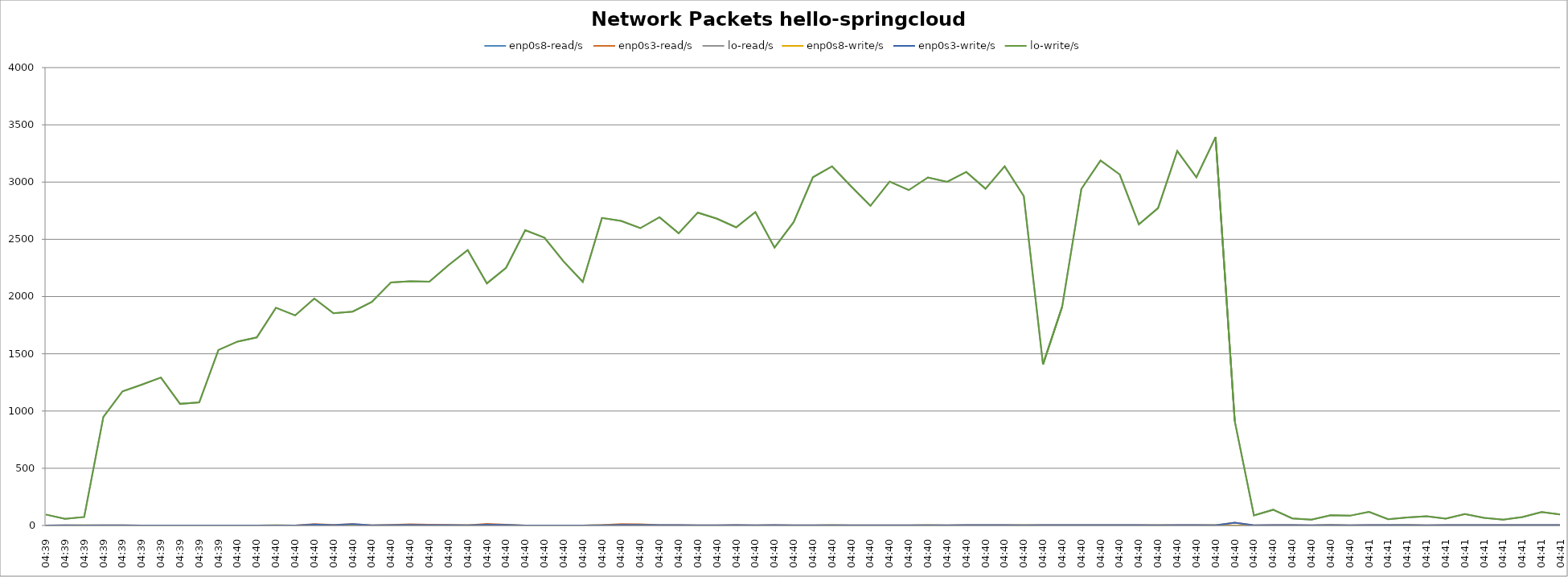
| Category | enp0s8-read/s | enp0s3-read/s | lo-read/s | enp0s8-write/s | enp0s3-write/s | lo-write/s |
|---|---|---|---|---|---|---|
| 04:39 | 0 | 0.3 | 95.9 | 0 | 0.3 | 95.9 |
| 04:39 | 0 | 1 | 58.6 | 0 | 1 | 58.6 |
| 04:39 | 1 | 0 | 74.5 | 1 | 0 | 74.5 |
| 04:39 | 0 | 1 | 948.6 | 0 | 1 | 948.6 |
| 04:39 | 0 | 1 | 1172.2 | 0 | 1 | 1172.2 |
| 04:39 | 0 | 0 | 1230 | 0 | 0 | 1230 |
| 04:39 | 0 | 0 | 1292.6 | 0 | 0 | 1292.6 |
| 04:39 | 0 | 0 | 1062.6 | 0 | 0 | 1062.6 |
| 04:39 | 0 | 0 | 1075.6 | 0 | 0 | 1075.6 |
| 04:39 | 0 | 0 | 1532.9 | 0 | 0 | 1532.9 |
| 04:40 | 0 | 0 | 1606.9 | 0 | 0 | 1606.9 |
| 04:40 | 0 | 0 | 1643.1 | 0 | 0 | 1643.1 |
| 04:40 | 1 | 0 | 1902.1 | 1 | 0 | 1902.1 |
| 04:40 | 0 | 0 | 1835.3 | 0 | 0 | 1835.3 |
| 04:40 | 0 | 11.8 | 1982.7 | 0 | 8.9 | 1982.7 |
| 04:40 | 0 | 4.9 | 1853.8 | 0 | 2.9 | 1853.8 |
| 04:40 | 0 | 11.7 | 1868.1 | 0 | 11.7 | 1868.1 |
| 04:40 | 0 | 1 | 1952.9 | 0 | 1 | 1952.9 |
| 04:40 | 0 | 5.9 | 2123.6 | 0 | 3 | 2123.6 |
| 04:40 | 0 | 9.8 | 2133.8 | 0 | 4.9 | 2133.8 |
| 04:40 | 0 | 6.9 | 2130 | 0 | 3.9 | 2130 |
| 04:40 | 0 | 5.9 | 2274.7 | 0 | 3.9 | 2274.7 |
| 04:40 | 2 | 2 | 2406.7 | 2 | 1 | 2406.7 |
| 04:40 | 0 | 14.8 | 2115.1 | 0 | 7.9 | 2115.1 |
| 04:40 | 0 | 7.9 | 2251.3 | 0 | 4.9 | 2251.3 |
| 04:40 | 0 | 0 | 2579.7 | 0 | 0 | 2579.7 |
| 04:40 | 0 | 0 | 2514.4 | 0 | 0 | 2514.4 |
| 04:40 | 0 | 0 | 2306.6 | 0 | 0 | 2306.6 |
| 04:40 | 0 | 0 | 2128 | 0 | 0 | 2128 |
| 04:40 | 1 | 3.9 | 2686.4 | 1 | 2 | 2686.4 |
| 04:40 | 0 | 11.9 | 2660.2 | 0 | 5.9 | 2660.2 |
| 04:40 | 1 | 9.9 | 2597.5 | 1 | 5.9 | 2597.5 |
| 04:40 | 0 | 3 | 2692.6 | 0 | 3 | 2692.6 |
| 04:40 | 0 | 3 | 2552.8 | 0 | 3 | 2552.8 |
| 04:40 | 0 | 2 | 2733.4 | 0 | 2 | 2733.4 |
| 04:40 | 0 | 2 | 2680.1 | 0 | 2 | 2680.1 |
| 04:40 | 0 | 3 | 2604.6 | 0 | 3 | 2604.6 |
| 04:40 | 0 | 1 | 2738.2 | 0 | 1 | 2738.2 |
| 04:40 | 0 | 2.8 | 2427.5 | 0 | 2.8 | 2427.5 |
| 04:40 | 0 | 1 | 2650.8 | 0 | 1 | 2650.8 |
| 04:40 | 0 | 1 | 3042.1 | 0 | 1 | 3042.1 |
| 04:40 | 1 | 1 | 3137.5 | 1 | 1 | 3137.5 |
| 04:40 | 0 | 1 | 2961.6 | 0 | 1 | 2961.6 |
| 04:40 | 0 | 1 | 2792.2 | 0 | 1 | 2792.2 |
| 04:40 | 0 | 1 | 3004.2 | 0 | 1 | 3004.2 |
| 04:40 | 0 | 1 | 2929.9 | 0 | 1 | 2929.9 |
| 04:40 | 1 | 1 | 3040.8 | 1 | 1 | 3040.8 |
| 04:40 | 0 | 2 | 3002.5 | 0 | 2 | 3002.5 |
| 04:40 | 0 | 3 | 3088.5 | 0 | 3 | 3088.5 |
| 04:40 | 0 | 2.9 | 2941.6 | 0 | 2.9 | 2941.6 |
| 04:40 | 0 | 2.9 | 3137.8 | 0 | 2.9 | 3137.8 |
| 04:40 | 1 | 2 | 2876.6 | 1 | 2 | 2876.6 |
| 04:40 | 0 | 3 | 1406.4 | 0 | 3 | 1406.4 |
| 04:40 | 0 | 2.9 | 1911.3 | 0 | 2.9 | 1911.3 |
| 04:40 | 0 | 3 | 2939.8 | 0 | 3 | 2939.8 |
| 04:40 | 0 | 3 | 3188.6 | 0 | 3 | 3188.6 |
| 04:40 | 0 | 3 | 3066.4 | 0 | 3 | 3066.4 |
| 04:40 | 0 | 2.9 | 2630.6 | 0 | 2.9 | 2630.6 |
| 04:40 | 2 | 2 | 2772.6 | 1 | 2 | 2772.6 |
| 04:40 | 0 | 3 | 3271.3 | 0 | 3 | 3271.3 |
| 04:40 | 0 | 3 | 3042.1 | 0 | 3 | 3042.1 |
| 04:40 | 1 | 2 | 3392.5 | 1 | 2 | 3392.5 |
| 04:40 | 0 | 23.7 | 911 | 0 | 23.7 | 911 |
| 04:40 | 0 | 2 | 88.3 | 0 | 2 | 88.3 |
| 04:40 | 0 | 3 | 137.6 | 0 | 3 | 137.6 |
| 04:40 | 0 | 3 | 61.4 | 0 | 3 | 61.4 |
| 04:40 | 0 | 2 | 50.7 | 0 | 2 | 50.7 |
| 04:40 | 1 | 3 | 89.4 | 1 | 3 | 89.4 |
| 04:40 | 0 | 2 | 85.3 | 0 | 2 | 85.3 |
| 04:41 | 0 | 3 | 119.1 | 0 | 3 | 119.1 |
| 04:41 | 0 | 3 | 54.7 | 0 | 3 | 54.7 |
| 04:41 | 1 | 3 | 69.6 | 1 | 3 | 69.6 |
| 04:41 | 0 | 2 | 81.5 | 0 | 2 | 81.5 |
| 04:41 | 0 | 3 | 59.6 | 0 | 3 | 59.6 |
| 04:41 | 0 | 3 | 99.4 | 0 | 3 | 99.4 |
| 04:41 | 0 | 3 | 67.6 | 0 | 3 | 67.6 |
| 04:41 | 0 | 3 | 51.7 | 0 | 3 | 51.7 |
| 04:41 | 0 | 4 | 73.5 | 0 | 4 | 73.5 |
| 04:41 | 0 | 3 | 118.2 | 0 | 3 | 118.2 |
| 04:41 | 0 | 3 | 96.4 | 0 | 3 | 96.4 |